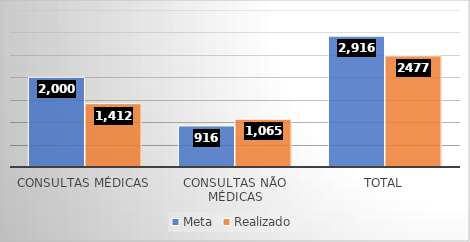
| Category | Meta | Realizado |
|---|---|---|
| Consultas Médicas | 2000 | 1412 |
| Consultas não médicas | 916 | 1065 |
| Total | 2916 | 2477 |